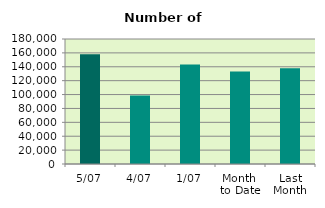
| Category | Series 0 |
|---|---|
| 5/07 | 158028 |
| 4/07 | 98692 |
| 1/07 | 143366 |
| Month 
to Date | 133362 |
| Last
Month | 138016.909 |